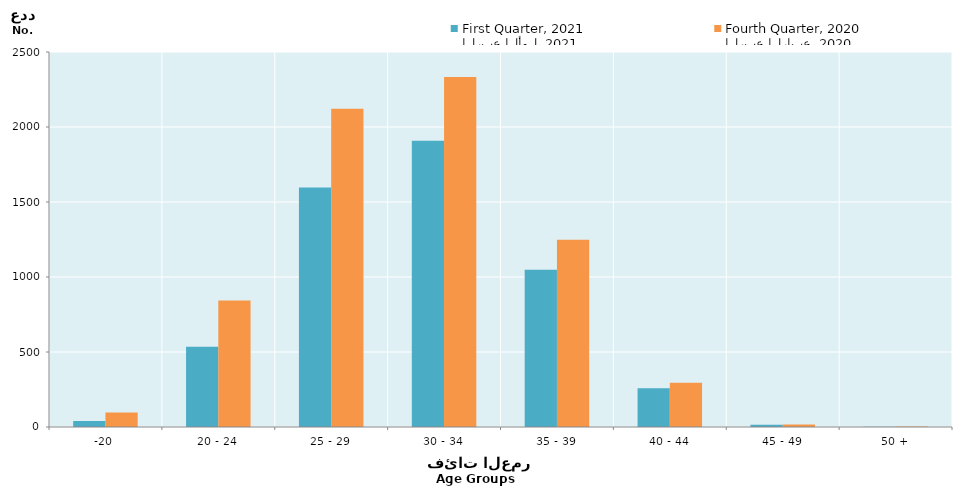
| Category | الربع الأول، 2021
First Quarter, 2021 | الربع الرابع، 2020
Fourth Quarter, 2020 |
|---|---|---|
| -20 | 40 | 96 |
| 20 - 24 | 535 | 843 |
| 25 - 29 | 1596 | 2122 |
| 30 - 34 | 1908 | 2334 |
| 35 - 39 | 1049 | 1248 |
| 40 - 44 | 259 | 295 |
| 45 - 49 | 15 | 17 |
| 50 + | 2 | 3 |